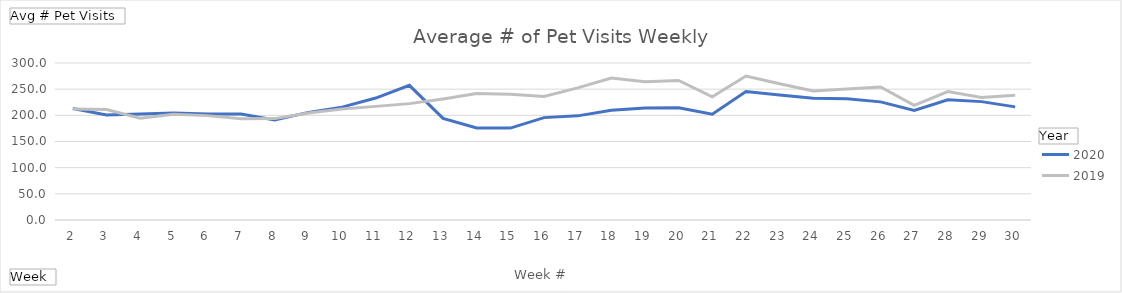
| Category | 2020 | 2019 |
|---|---|---|
| 2 | 213.227 | 211.92 |
| 3 | 200.864 | 210.92 |
| 4 | 202.568 | 194.648 |
| 5 | 204.341 | 202.068 |
| 6 | 202.75 | 199.443 |
| 7 | 202.67 | 193.705 |
| 8 | 191.148 | 193.716 |
| 9 | 205.648 | 204.557 |
| 10 | 215.705 | 212.159 |
| 11 | 232.989 | 217.114 |
| 12 | 257.273 | 222.364 |
| 13 | 194.057 | 231.341 |
| 14 | 175.92 | 241.716 |
| 15 | 175.67 | 240.443 |
| 16 | 195.625 | 235.875 |
| 17 | 198.989 | 252.375 |
| 18 | 209.659 | 271.284 |
| 19 | 213.841 | 264.205 |
| 20 | 214.42 | 266.773 |
| 21 | 202.136 | 235.534 |
| 22 | 245.42 | 275.125 |
| 23 | 238.886 | 260.443 |
| 24 | 232.864 | 246.33 |
| 25 | 231.534 | 250.125 |
| 26 | 225.727 | 254.33 |
| 27 | 209.557 | 219.193 |
| 28 | 229.818 | 245.409 |
| 29 | 226.193 | 233.977 |
| 30 | 216.159 | 238.341 |